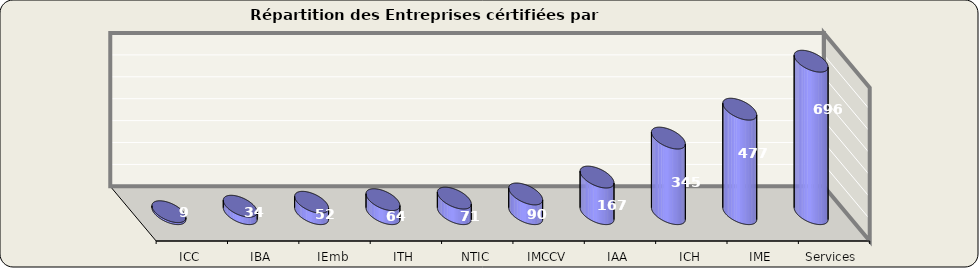
| Category | Series 0 |
|---|---|
| Services | 696 |
| IME | 477 |
| ICH | 345 |
| IAA | 167 |
| IMCCV | 90 |
| NTIC | 71 |
| ITH | 64 |
| IEmb | 52 |
| IBA | 34 |
| ICC | 9 |